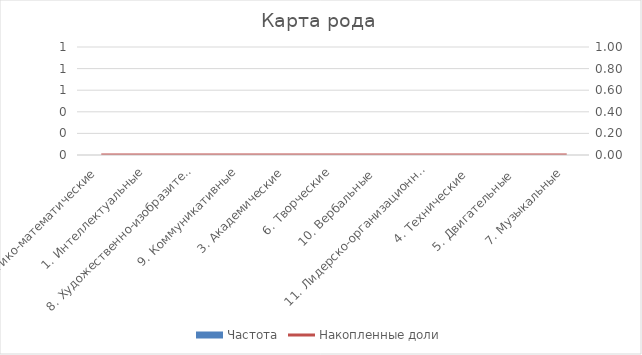
| Category | Частота |
|---|---|
| 2. Логико-математические | 0 |
| 1. Интеллектуальные | 0 |
| 8. Художественно-изобразительные | 0 |
| 9. Коммуникативные | 0 |
| 3. Академические | 0 |
| 6. Творческие | 0 |
| 10. Вербальные  | 0 |
| 11. Лидерско-организационные | 0 |
| 4. Технические  | 0 |
| 5. Двигательные  | 0 |
| 7. Музыкальные | 0 |